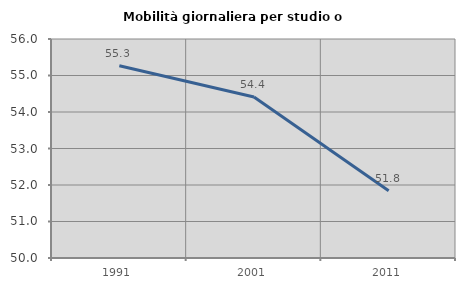
| Category | Mobilità giornaliera per studio o lavoro |
|---|---|
| 1991.0 | 55.268 |
| 2001.0 | 54.413 |
| 2011.0 | 51.845 |